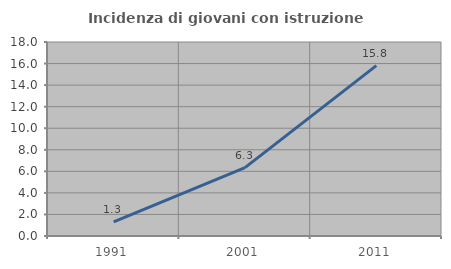
| Category | Incidenza di giovani con istruzione universitaria |
|---|---|
| 1991.0 | 1.304 |
| 2001.0 | 6.349 |
| 2011.0 | 15.807 |